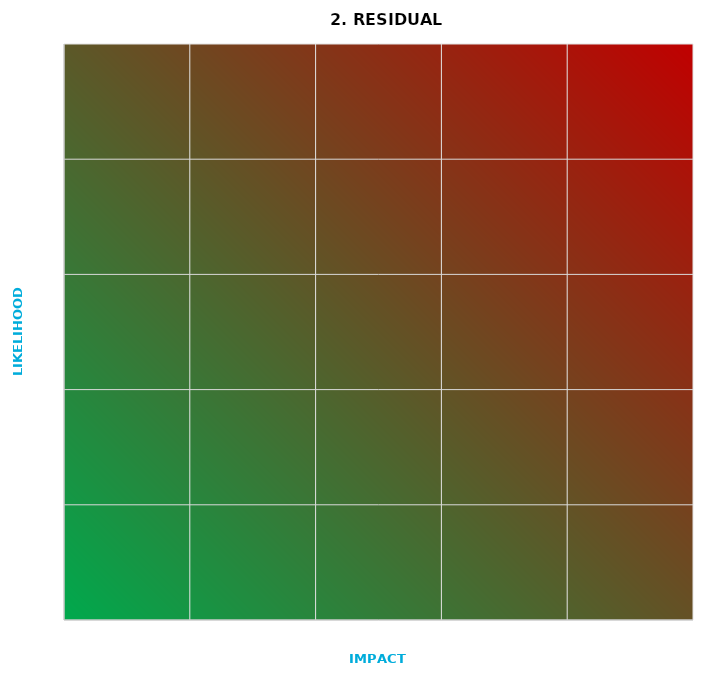
| Category | Residual risk |
|---|---|
| 0.0 | 0 |
| 0.0 | 0 |
| 0.0 | 0 |
| 0.0 | 0 |
| 0.0 | 0 |
| 0.0 | 0 |
| 0.0 | 0 |
| 0.0 | 0 |
| 0.0 | 0 |
| 0.0 | 0 |
| 0.0 | 0 |
| 0.0 | 0 |
| 0.0 | 0 |
| 0.0 | 0 |
| 0.0 | 0 |
| 0.0 | 0 |
| 0.0 | 0 |
| 0.0 | 0 |
| 0.0 | 0 |
| 0.0 | 0 |
| 0.0 | 0 |
| 0.0 | 0 |
| 0.0 | 0 |
| 0.0 | 0 |
| 0.0 | 0 |
| 0.0 | 0 |
| 0.0 | 0 |
| 0.0 | 0 |
| 0.0 | 0 |
| 0.0 | 0 |
| 0.0 | 0 |
| 0.0 | 0 |
| 0.0 | 0 |
| 0.0 | 0 |
| 0.0 | 0 |
| 0.0 | 0 |
| 0.0 | 0 |
| 0.0 | 0 |
| 0.0 | 0 |
| 0.0 | 0 |
| 0.0 | 0 |
| 0.0 | 0 |
| 0.0 | 0 |
| 0.0 | 0 |
| 0.0 | 0 |
| 0.0 | 0 |
| 0.0 | 0 |
| 0.0 | 0 |
| 0.0 | 0 |
| 0.0 | 0 |
| 0.0467916617695678 | 0.058 |
| 0.0715962875500932 | 0.045 |
| -0.0153381002045089 | 0.088 |
| -0.0385288569063828 | 0.082 |
| 0.0847212617389883 | -0.021 |
| -0.0335882802793444 | 0.038 |
| 0.0730382408139137 | 0.036 |
| -0.00489608390610219 | 0.07 |
| 0.0374513533905051 | 0.004 |
| -0.067181945105047 | -0.067 |
| 0.0371411591526426 | 0.1 |
| 0.07640537291421 | -0.085 |
| -0.069326217001629 | 0.001 |
| -0.0386712526946744 | 0.078 |
| 0.0231020085160097 | -0.079 |
| -0.0793038822352517 | 0.022 |
| 0.0525632063849308 | 0.068 |
| 0.00864098987978563 | -0.091 |
| 0.0515354074308472 | 0.01 |
| -0.0373756084204719 | 0.023 |
| 0.0932393273517678 | -0.1 |
| 0.0305955374992189 | 0.049 |
| -0.0330215497260943 | 0.041 |
| 0.0479632189231131 | -0.053 |
| 0.0630480821316813 | -0.043 |
| -0.0671926502888666 | -0.022 |
| 0.00400593352588088 | -0.045 |
| -0.0728276780543882 | 0.021 |
| 0.0403360357452648 | -0.078 |
| -0.00209111426502757 | -0.04 |
| 0.0961680867276855 | 0.091 |
| 0.0691846354367353 | 0.038 |
| -0.00968217156692419 | -0.095 |
| 0.0411500827786697 | 0.003 |
| 0.0295634479682282 | 0.054 |
| -0.0508335946837723 | 0.008 |
| 0.06491568060541 | 0.092 |
| -0.0750830268608901 | -0.028 |
| -0.0502627358507187 | -0.001 |
| -0.0269291663356024 | -0.082 |
| 0.00766433989671551 | 0.071 |
| -0.025219404880965 | 0.095 |
| -0.00643285789958716 | 0.028 |
| 0.0375647027383653 | 0.03 |
| 0.0144731060092818 | 0.084 |
| 0.0346550827179692 | 0.009 |
| -0.00267720836352514 | -0.05 |
| 0.0482462054328613 | -0.094 |
| -0.0312631590606812 | 0.038 |
| -0.0512112079200851 | 0.043 |
| 0.00534018135277048 | -0.082 |
| 0.0655903539304846 | 0.037 |
| -0.0768488325153429 | 0.063 |
| -0.0732709989869071 | 0.091 |
| -0.0281205456139864 | -0.093 |
| -0.0798937729443345 | -0.039 |
| -0.02893370157983 | 0.067 |
| -0.034705818398129 | -0.018 |
| 0.070409528829975 | 0.091 |
| -0.0568110787403891 | 0.025 |
| 0.015746488835261 | 0.068 |
| 0.0277334121970258 | 0.027 |
| 0.0617455089996553 | 0.069 |
| 0.00759375114985372 | -0.099 |
| -0.0685924328558589 | 0.016 |
| 0.0300876808858736 | 0.033 |
| 0.0773196207900855 | -0.024 |
| 0.0865471722190638 | 0.036 |
| 0.0663298270659896 | -0.01 |
| 0.0059989658495428 | -0.007 |
| -0.0443512033558429 | -0.062 |
| -0.0185477005908926 | -0.031 |
| -0.0339193087171371 | 0.087 |
| -0.0535345359246353 | 0.097 |
| 0.00244252661291522 | -0.065 |
| -0.0782063895653264 | 0.035 |
| -0.017101149530973 | -0.039 |
| 0.0683365570532182 | 0.005 |
| -0.0758814696053393 | -0.002 |
| -0.0236087827710979 | -0.026 |
| 0.0872481163850781 | -0.037 |
| -0.0307874274007026 | -0.017 |
| -0.0347902761717302 | -0.062 |
| -0.0863666025356903 | 0.067 |
| -0.0610019023758467 | 0.042 |
| 0.0389840699492482 | 0.099 |
| 0.0322902549024238 | 0.072 |
| -0.0707530144748369 | -0.088 |
| 0.0472550674789183 | -0.052 |
| 0.0635778520340757 | 0.076 |
| -0.0359124152434419 | -0.02 |
| -0.0982866842090059 | 0.062 |
| -0.036026369214555 | 0.07 |
| -0.0917536929736782 | -0.005 |
| 0.0195429336145565 | -0.071 |
| 0.0327833675037819 | -0.092 |
| 0.0895318851460789 | -0.023 |
| -0.0939771269192637 | -0.095 |
| -0.0458090807965814 | 0.078 |
| -0.0124080852506308 | 0.038 |
| -0.0952426519497781 | -0.018 |
| -0.0562458952548638 | 0.096 |
| -0.0064657054208183 | -0.085 |
| 0.0131783845319222 | -0.08 |
| -0.0566547423215112 | -0.051 |
| -0.0897817589051776 | -0.064 |
| 0.085787772256401 | -0.025 |
| -0.0725434950821558 | 0.091 |
| 0.084954062262108 | 0.016 |
| 0.06353286764225 | 0.034 |
| -0.0768609194708512 | 0.092 |
| 0.0602536085459936 | -0.056 |
| 0.0375066067790178 | 0.017 |
| -0.0603202761788167 | -0.03 |
| -0.0852544051086792 | 0.063 |
| 0.0307030885978075 | 0.098 |
| 0.0478730128374507 | 0.068 |
| 0.0774780079974681 | -0.001 |
| -0.0228568592321474 | -0.006 |
| -0.00228888165307204 | -0.06 |
| -0.0484640835716737 | -0.031 |
| -0.054760520842255 | 0.011 |
| -0.0911982920984025 | -0.06 |
| -0.0707030631123479 | 0.038 |
| -0.0104451915321982 | 0.066 |
| 0.0883267610621945 | 0.017 |
| 0.0886595809858483 | -0.071 |
| -0.0698921205214703 | -0.051 |
| -0.0487227031312617 | -0.092 |
| -0.0280713231058624 | 0.021 |
| 0.0481760512860742 | -0.009 |
| 0.0604252544438387 | -0.097 |
| -0.0745347542278205 | -0.036 |
| -0.0487479498687487 | 0.008 |
| 0.0809816766612162 | -0.045 |
| 0.0322921739440462 | -0.094 |
| 0.0492252316694718 | -0.036 |
| 0.0165103586426067 | 0.013 |
| 0.0305699083609825 | 0.077 |
| -0.0271948983343371 | 0.029 |
| 0.0668495043874752 | -0.091 |
| 0.00104880072494551 | 0.079 |
| -0.0644589156927377 | -0.011 |
| -0.0647412414452475 | -0.004 |
| 0.0202722548377035 | -0.014 |
| -0.0743971921668 | -0.083 |
| -0.0685517892662347 | 0.06 |
| -0.0147902152915957 | -0.038 |
| 0.0892659156354412 | -0.089 |
| -0.0878006097705808 | -0.017 |